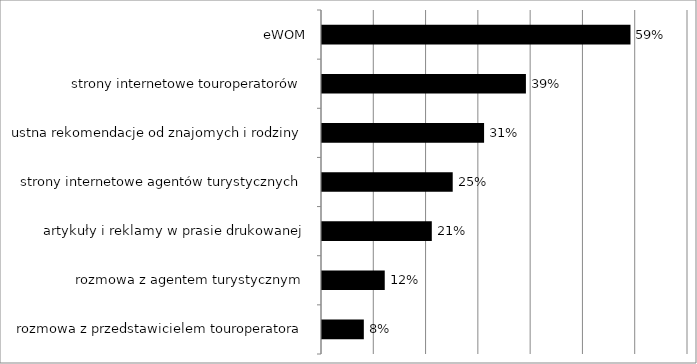
| Category | Series 0 |
|---|---|
| rozmowa z przedstawicielem touroperatora | 0.08 |
| rozmowa z agentem turystycznym | 0.12 |
| artykuły i reklamy w prasie drukowanej | 0.21 |
| strony internetowe agentów turystycznych | 0.25 |
| ustna rekomendacje od znajomych i rodziny | 0.31 |
| strony internetowe touroperatorów | 0.39 |
| eWOM | 0.59 |